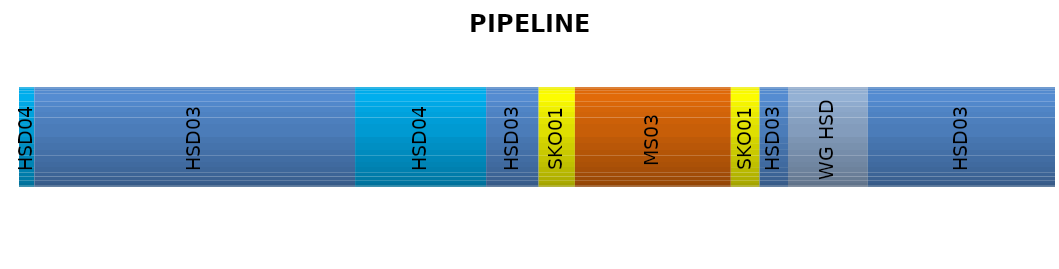
| Category | HSD04 | HSD03 | SKO01 | MS03 | WG HSD | Series 10 | Series 11 | Series 12 | Series 13 | Series 14 |
|---|---|---|---|---|---|---|---|---|---|---|
| 0 | 10092 | 14412 | 2214 | 12009 | 6154 |  |  |  |  |  |